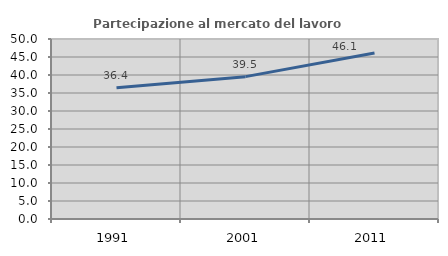
| Category | Partecipazione al mercato del lavoro  femminile |
|---|---|
| 1991.0 | 36.448 |
| 2001.0 | 39.546 |
| 2011.0 | 46.105 |